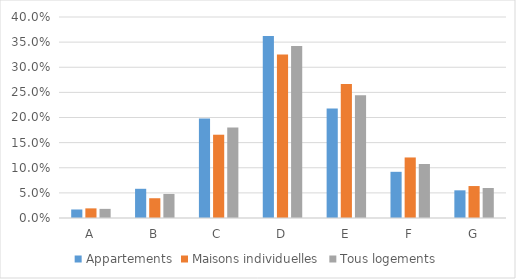
| Category | Appartements | Maisons individuelles | Tous logements |
|---|---|---|---|
| A | 0.017 | 0.019 | 0.018 |
| B | 0.058 | 0.039 | 0.048 |
| C | 0.198 | 0.166 | 0.18 |
| D | 0.362 | 0.325 | 0.342 |
| E | 0.218 | 0.266 | 0.244 |
| F | 0.092 | 0.12 | 0.107 |
| G | 0.055 | 0.064 | 0.06 |